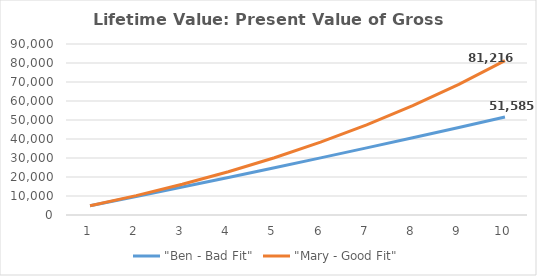
| Category | "Ben - Bad Fit" | "Mary - Good Fit" |
|---|---|---|
| 0 | 4830.918 | 4830.918 |
| 1 | 9731.849 | 10198.604 |
| 2 | 14703.808 | 16162.701 |
| 3 | 19747.825 | 22789.474 |
| 4 | 24864.943 | 30152.556 |
| 5 | 30056.222 | 38333.758 |
| 6 | 35322.738 | 47423.982 |
| 7 | 40665.579 | 57524.231 |
| 8 | 46085.853 | 68746.73 |
| 9 | 51584.682 | 81216.174 |